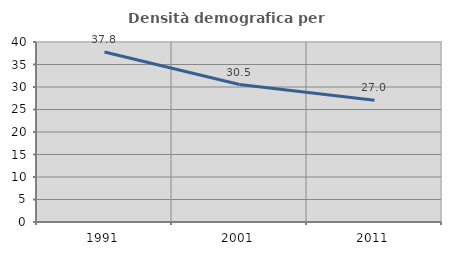
| Category | Densità demografica |
|---|---|
| 1991.0 | 37.772 |
| 2001.0 | 30.544 |
| 2011.0 | 27.047 |